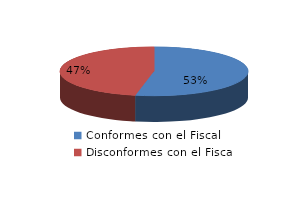
| Category | Series 0 |
|---|---|
| 0 | 286 |
| 1 | 252 |